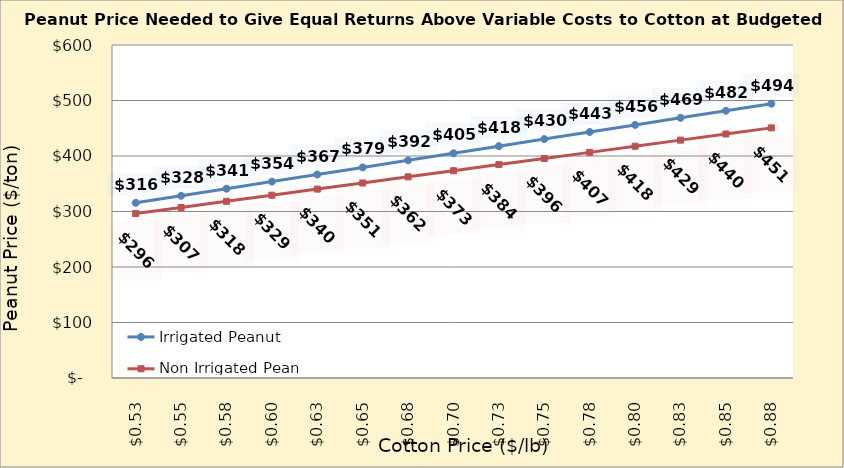
| Category | Irrigated Peanut | Non Irrigated Peanut |
|---|---|---|
| 0.5249999999999998 | 315.586 | 296.252 |
| 0.5499999999999998 | 328.352 | 307.281 |
| 0.5749999999999998 | 341.118 | 318.31 |
| 0.5999999999999999 | 353.884 | 329.34 |
| 0.6249999999999999 | 366.65 | 340.369 |
| 0.6499999999999999 | 379.416 | 351.399 |
| 0.6749999999999999 | 392.182 | 362.428 |
| 0.7 | 404.948 | 373.457 |
| 0.725 | 417.714 | 384.487 |
| 0.75 | 430.48 | 395.516 |
| 0.775 | 443.246 | 406.546 |
| 0.8 | 456.012 | 417.575 |
| 0.8250000000000001 | 468.778 | 428.604 |
| 0.8500000000000001 | 481.544 | 439.634 |
| 0.8750000000000001 | 494.31 | 450.663 |